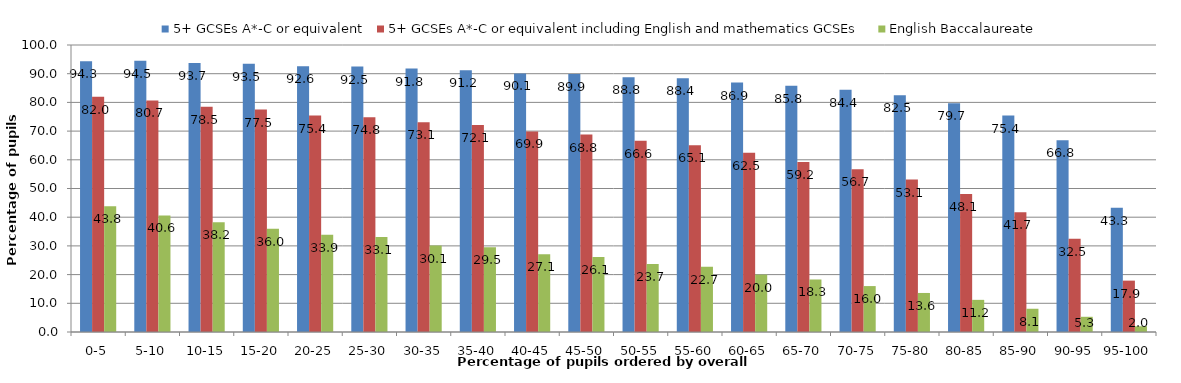
| Category | 5+ GCSEs A*-C or equivalent | 5+ GCSEs A*-C or equivalent including English and mathematics GCSEs | English Baccalaureate |
|---|---|---|---|
| 0-5 | 94.3 | 82 | 43.8 |
| 5-10 | 94.5 | 80.7 | 40.6 |
| 10-15 | 93.7 | 78.5 | 38.2 |
| 15-20 | 93.5 | 77.5 | 36 |
| 20-25 | 92.6 | 75.4 | 33.9 |
| 25-30 | 92.5 | 74.8 | 33.1 |
| 30-35 | 91.8 | 73.1 | 30.1 |
| 35-40 | 91.2 | 72.1 | 29.5 |
| 40-45 | 90.1 | 69.9 | 27.1 |
| 45-50 | 89.9 | 68.8 | 26.1 |
| 50-55 | 88.8 | 66.6 | 23.7 |
| 55-60 | 88.4 | 65.1 | 22.7 |
| 60-65 | 86.9 | 62.5 | 20 |
| 65-70 | 85.8 | 59.2 | 18.3 |
| 70-75 | 84.4 | 56.7 | 16 |
| 75-80 | 82.5 | 53.1 | 13.6 |
| 80-85 | 79.7 | 48.1 | 11.2 |
| 85-90 | 75.4 | 41.7 | 8.1 |
| 90-95 | 66.8 | 32.5 | 5.3 |
| 95-100 | 43.3 | 17.9 | 2 |